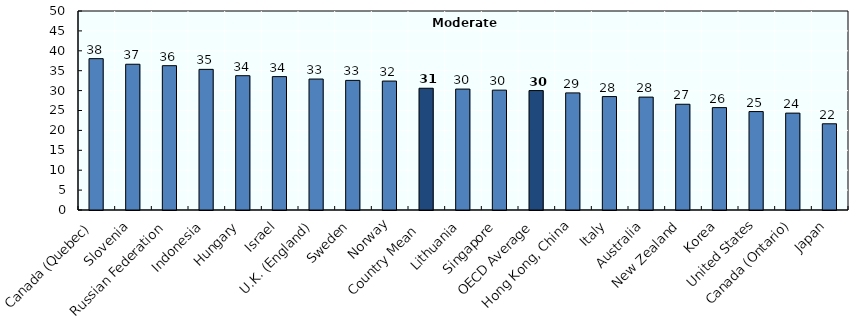
| Category | Series 0 |
|---|---|
| Canada (Quebec) | 38.028 |
| Slovenia | 36.622 |
| Russian Federation | 36.261 |
| Indonesia | 35.335 |
| Hungary | 33.746 |
| Israel | 33.512 |
| U.K. (England) | 32.904 |
| Sweden | 32.566 |
| Norway | 32.399 |
| Country Mean  | 30.589 |
| Lithuania | 30.384 |
| Singapore | 30.115 |
| OECD Average | 30.003 |
| Hong Kong, China | 29.422 |
| Italy | 28.5 |
| Australia | 28.365 |
| New Zealand | 26.569 |
| Korea | 25.724 |
| United States | 24.73 |
| Canada (Ontario) | 24.342 |
| Japan | 21.661 |